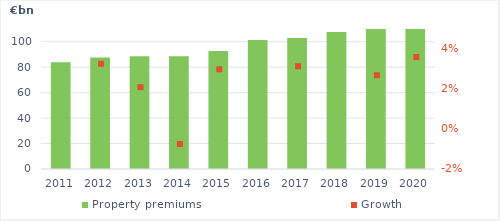
| Category | Property premiums |
|---|---|
| 2011.0 | 83.835 |
| 2012.0 | 87.519 |
| 2013.0 | 88.594 |
| 2014.0 | 88.587 |
| 2015.0 | 92.691 |
| 2016.0 | 101.357 |
| 2017.0 | 102.984 |
| 2018.0 | 107.704 |
| 2019.0 | 110.975 |
| 2020.0 | 114.046 |